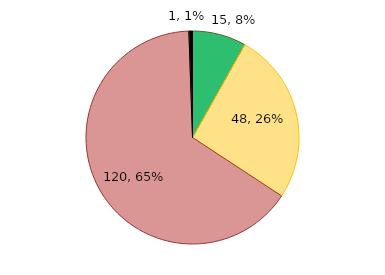
| Category | Series 0 |
|---|---|
| Abaixo do limite alerta | 15 |
| Entre o limite alerta e o máximo | 48 |
| Acima do limite máximo | 120 |
| Não informaram | 1 |